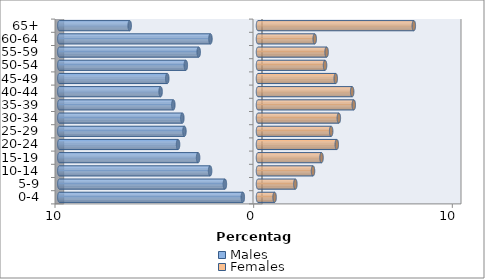
| Category | Males | Females |
|---|---|---|
| 0-4 | -0.764 | 0.835 |
| 5-9 | -1.667 | 1.88 |
| 10-14 | -2.411 | 2.769 |
| 15-19 | -3.015 | 3.197 |
| 20-24 | -4.024 | 3.966 |
| 25-29 | -3.703 | 3.682 |
| 30-34 | -3.809 | 4.07 |
| 35-39 | -4.262 | 4.821 |
| 40-44 | -4.903 | 4.74 |
| 45-49 | -4.568 | 3.914 |
| 50-54 | -3.633 | 3.375 |
| 55-59 | -2.985 | 3.454 |
| 60-64 | -2.394 | 2.856 |
| 65+ | -6.459 | 7.844 |